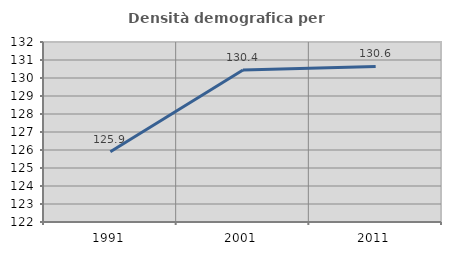
| Category | Densità demografica |
|---|---|
| 1991.0 | 125.9 |
| 2001.0 | 130.445 |
| 2011.0 | 130.645 |